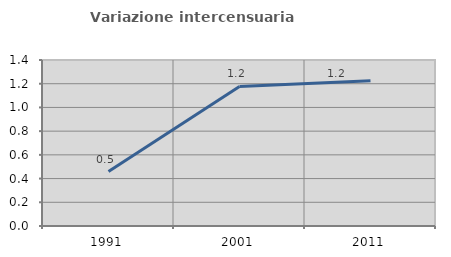
| Category | Variazione intercensuaria annua |
|---|---|
| 1991.0 | 0.459 |
| 2001.0 | 1.177 |
| 2011.0 | 1.224 |